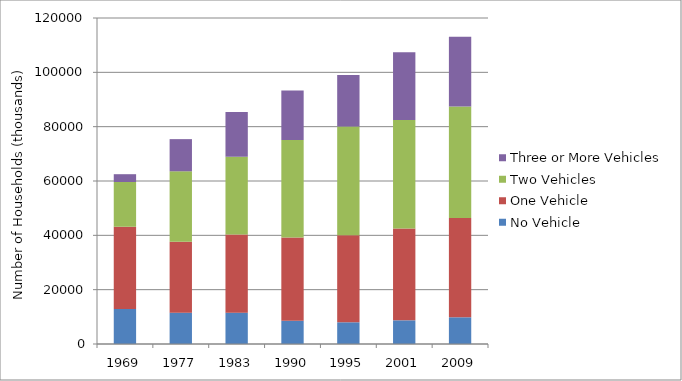
| Category | No Vehicle | One Vehicle | Two Vehicles | Three or More Vehicles |
|---|---|---|---|---|
| 1969.0 | 12876 | 30252 | 16501 | 2875 |
| 1977.0 | 11538 | 26092 | 25942 | 11840 |
| 1983.0 | 11548 | 28780 | 28632 | 16411 |
| 1990.0 | 8573 | 30654 | 35872 | 18248 |
| 1995.0 | 7989 | 32064 | 40024 | 18914 |
| 2001.0 | 8716 | 33757 | 39938 | 24955 |
| 2009.0 | 9827.977 | 36508.561 | 41077.106 | 25687.686 |